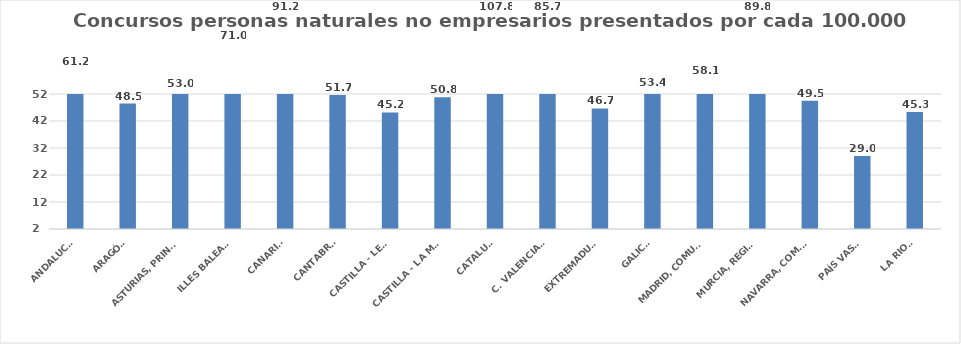
| Category | Series 0 |
|---|---|
| ANDALUCÍA | 61.245 |
| ARAGÓN | 48.469 |
| ASTURIAS, PRINCIPADO | 52.95 |
| ILLES BALEARS | 71.019 |
| CANARIAS | 91.192 |
| CANTABRIA | 51.654 |
| CASTILLA - LEÓN | 45.161 |
| CASTILLA - LA MANCHA | 50.754 |
| CATALUÑA | 107.798 |
| C. VALENCIANA | 85.68 |
| EXTREMADURA | 46.666 |
| GALICIA | 53.413 |
| MADRID, COMUNIDAD | 58.053 |
| MURCIA, REGIÓN | 89.844 |
| NAVARRA, COM. FORAL | 49.539 |
| PAÍS VASCO | 29.01 |
| LA RIOJA | 45.305 |